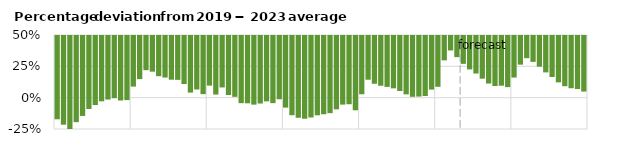
| Category | Deviation from average |
|---|---|
| 2019-01-01 | -0.164 |
| 2019-02-01 | -0.208 |
| 2019-03-01 | -0.283 |
| 2019-04-01 | -0.187 |
| 2019-05-01 | -0.138 |
| 2019-06-01 | -0.082 |
| 2019-07-01 | -0.051 |
| 2019-08-01 | -0.021 |
| 2019-09-01 | -0.007 |
| 2019-10-01 | 0.004 |
| 2019-11-01 | -0.015 |
| 2019-12-01 | -0.011 |
| 2020-01-01 | 0.096 |
| 2020-02-01 | 0.156 |
| 2020-03-01 | 0.227 |
| 2020-04-01 | 0.215 |
| 2020-05-01 | 0.179 |
| 2020-06-01 | 0.169 |
| 2020-07-01 | 0.151 |
| 2020-08-01 | 0.15 |
| 2020-09-01 | 0.116 |
| 2020-10-01 | 0.048 |
| 2020-11-01 | 0.073 |
| 2020-12-01 | 0.036 |
| 2021-01-01 | 0.104 |
| 2021-02-01 | 0.033 |
| 2021-03-01 | 0.089 |
| 2021-04-01 | 0.029 |
| 2021-05-01 | 0.015 |
| 2021-06-01 | -0.036 |
| 2021-07-01 | -0.037 |
| 2021-08-01 | -0.048 |
| 2021-09-01 | -0.039 |
| 2021-10-01 | -0.022 |
| 2021-11-01 | -0.036 |
| 2021-12-01 | -0.004 |
| 2022-01-01 | -0.071 |
| 2022-02-01 | -0.132 |
| 2022-03-01 | -0.152 |
| 2022-04-01 | -0.16 |
| 2022-05-01 | -0.15 |
| 2022-06-01 | -0.133 |
| 2022-07-01 | -0.124 |
| 2022-08-01 | -0.115 |
| 2022-09-01 | -0.085 |
| 2022-10-01 | -0.047 |
| 2022-11-01 | -0.044 |
| 2022-12-01 | -0.093 |
| 2023-01-01 | 0.035 |
| 2023-02-01 | 0.151 |
| 2023-03-01 | 0.119 |
| 2023-04-01 | 0.103 |
| 2023-05-01 | 0.094 |
| 2023-06-01 | 0.082 |
| 2023-07-01 | 0.061 |
| 2023-08-01 | 0.034 |
| 2023-09-01 | 0.015 |
| 2023-10-01 | 0.017 |
| 2023-11-01 | 0.021 |
| 2023-12-01 | 0.072 |
| 2024-01-01 | 0.095 |
| 2024-02-01 | 0.306 |
| 2024-03-01 | 0.385 |
| 2024-04-01 | 0.331 |
| 2024-05-01 | 0.278 |
| 2024-06-01 | 0.233 |
| 2024-07-01 | 0.201 |
| 2024-08-01 | 0.159 |
| 2024-09-01 | 0.121 |
| 2024-10-01 | 0.101 |
| 2024-11-01 | 0.103 |
| 2024-12-01 | 0.092 |
| 2025-01-01 | 0.168 |
| 2025-02-01 | 0.271 |
| 2025-03-01 | 0.323 |
| 2025-04-01 | 0.293 |
| 2025-05-01 | 0.255 |
| 2025-06-01 | 0.209 |
| 2025-07-01 | 0.173 |
| 2025-08-01 | 0.13 |
| 2025-09-01 | 0.099 |
| 2025-10-01 | 0.083 |
| 2025-11-01 | 0.077 |
| 2025-12-01 | 0.057 |